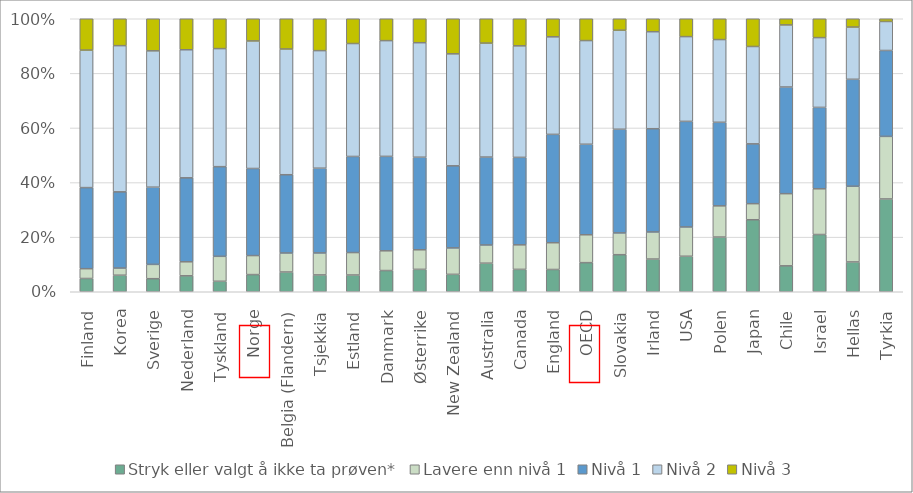
| Category | Stryk eller valgt å ikke ta prøven* | Lavere enn nivå 1 | Nivå 1 | Nivå 2 | Nivå 3 |
|---|---|---|---|---|---|
| Finland | 4.855 | 3.592 | 29.701 | 50.366 | 11.486 |
| Korea | 6.061 | 2.62 | 27.912 | 53.558 | 9.85 |
| Sverige | 4.785 | 5.24 | 28.285 | 49.946 | 11.745 |
| Nederland | 5.84 | 5.133 | 30.759 | 46.912 | 11.356 |
| Tyskland | 3.837 | 9.14 | 32.842 | 43.248 | 10.932 |
| Norge | 6.285 | 6.965 | 31.898 | 46.719 | 8.132 |
| Belgia (Flandern) | 7.229 | 6.965 | 28.67 | 46.05 | 11.086 |
| Tsjekkia | 6.165 | 8.052 | 31.043 | 43.062 | 11.678 |
| Estland | 6.131 | 8.227 | 35.202 | 41.366 | 9.075 |
| Danmark | 7.771 | 7.227 | 34.591 | 42.397 | 8.014 |
| Østerrike | 8.204 | 7.174 | 33.906 | 41.939 | 8.777 |
| New Zealand | 6.376 | 9.679 | 30.075 | 41.021 | 12.85 |
| Australia | 10.465 | 6.669 | 32.204 | 41.74 | 8.923 |
| Canada | 8.201 | 8.986 | 32.036 | 40.856 | 9.922 |
| England | 8.156 | 9.802 | 39.694 | 35.73 | 6.618 |
| OECD | 10.701 | 10.25 | 33.283 | 38.114 | 8.022 |
| Slovakia | 13.571 | 7.979 | 37.978 | 36.271 | 4.201 |
| Irland | 11.978 | 9.921 | 37.824 | 35.529 | 4.748 |
| USA | 13 | 10.73 | 38.679 | 31.054 | 6.537 |
| Polen | 20.037 | 11.423 | 30.613 | 30.3 | 7.627 |
| Japan | 26.375 | 5.893 | 21.905 | 35.668 | 10.159 |
| Chile | 9.495 | 26.434 | 39.073 | 22.739 | 2.258 |
| Israel | 20.96 | 16.753 | 29.818 | 25.562 | 6.908 |
| Hellas | 10.92 | 27.731 | 39.173 | 19.133 | 3.044 |
| Tyrkia | 33.988 | 22.922 | 31.468 | 10.623 | 0.999 |